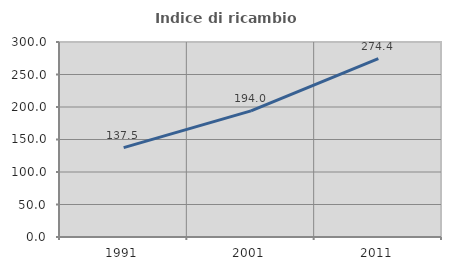
| Category | Indice di ricambio occupazionale  |
|---|---|
| 1991.0 | 137.5 |
| 2001.0 | 194 |
| 2011.0 | 274.359 |